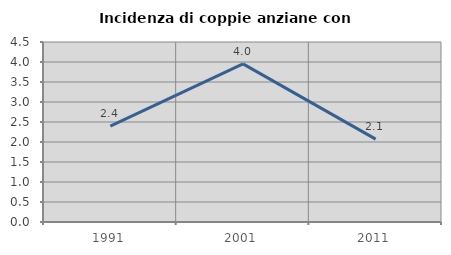
| Category | Incidenza di coppie anziane con figli |
|---|---|
| 1991.0 | 2.397 |
| 2001.0 | 3.953 |
| 2011.0 | 2.073 |